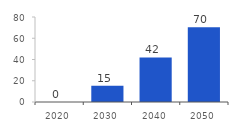
| Category | ON |
|---|---|
| 2020.0 | 0 |
| 2030.0 | 15.248 |
| 2040.0 | 41.978 |
| 2050.0 | 70.39 |